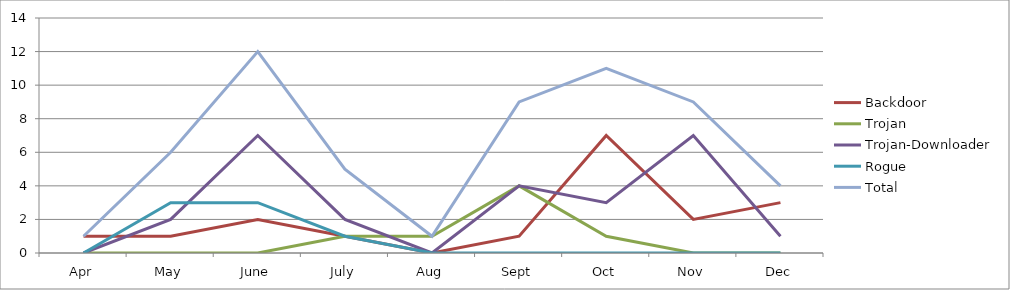
| Category | Backdoor | Trojan | Trojan-Downloader | Rogue | Total |
|---|---|---|---|---|---|
| Apr | 1 | 0 | 0 | 0 | 1 |
| May | 1 | 0 | 2 | 3 | 6 |
| June | 2 | 0 | 7 | 3 | 12 |
| July | 1 | 1 | 2 | 1 | 5 |
| Aug | 0 | 1 | 0 | 0 | 1 |
| Sept | 1 | 4 | 4 | 0 | 9 |
| Oct | 7 | 1 | 3 | 0 | 11 |
| Nov | 2 | 0 | 7 | 0 | 9 |
| Dec | 3 | 0 | 1 | 0 | 4 |